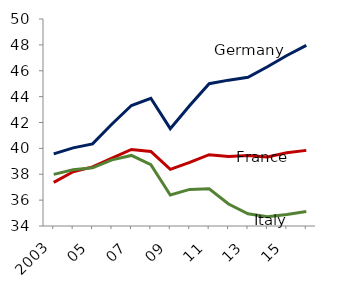
| Category | Germany | France | Italy |
|---|---|---|---|
| 2003 | 39.57 | 37.374 | 37.993 |
| 04 | 40.042 | 38.19 | 38.345 |
| 05 | 40.348 | 38.57 | 38.498 |
| 06 | 41.888 | 39.239 | 39.114 |
| 07 | 43.312 | 39.916 | 39.455 |
| 08 | 43.872 | 39.765 | 38.739 |
| 09 | 41.522 | 38.381 | 36.391 |
| 10 | 43.318 | 38.918 | 36.83 |
| 11 | 44.999 | 39.511 | 36.88 |
| 12 | 45.274 | 39.381 | 35.697 |
| 13 | 45.497 | 39.447 | 34.947 |
| 14 | 46.311 | 39.334 | 34.715 |
| 15 | 47.181 | 39.657 | 34.894 |
| 16 | 47.967 | 39.845 | 35.121 |